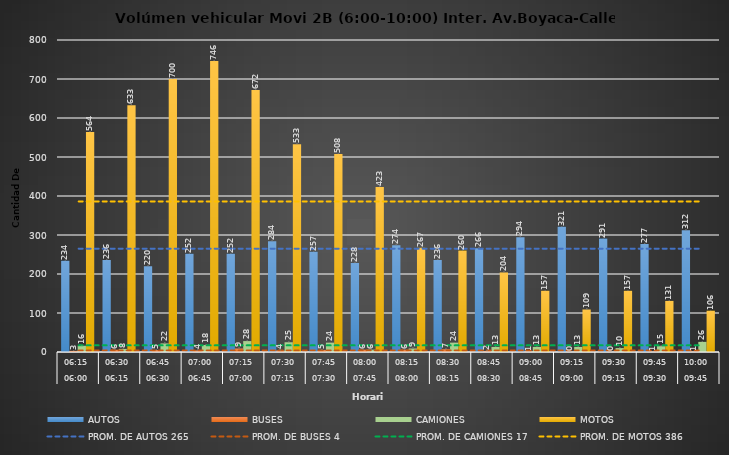
| Category | AUTOS | BUSES | CAMIONES | MOTOS |
|---|---|---|---|---|
| 0 | 234 | 3 | 16 | 564 |
| 1 | 236 | 6 | 8 | 633 |
| 2 | 220 | 5 | 22 | 700 |
| 3 | 252 | 4 | 18 | 746 |
| 4 | 252 | 9 | 28 | 672 |
| 5 | 284 | 4 | 25 | 533 |
| 6 | 257 | 5 | 24 | 508 |
| 7 | 228 | 6 | 6 | 423 |
| 8 | 274 | 6 | 9 | 267 |
| 9 | 236 | 7 | 24 | 260 |
| 10 | 266 | 2 | 13 | 204 |
| 11 | 294 | 1 | 13 | 157 |
| 12 | 321 | 0 | 13 | 109 |
| 13 | 291 | 0 | 10 | 157 |
| 14 | 277 | 1 | 15 | 131 |
| 15 | 312 | 1 | 26 | 106 |